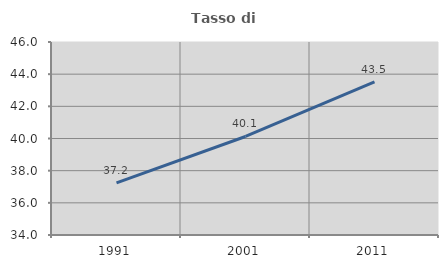
| Category | Tasso di occupazione   |
|---|---|
| 1991.0 | 37.245 |
| 2001.0 | 40.126 |
| 2011.0 | 43.524 |